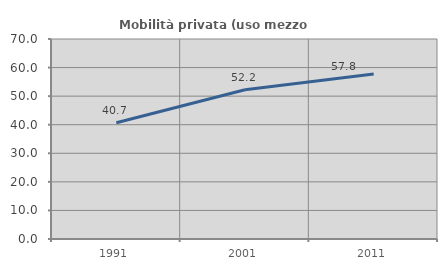
| Category | Mobilità privata (uso mezzo privato) |
|---|---|
| 1991.0 | 40.708 |
| 2001.0 | 52.221 |
| 2011.0 | 57.774 |